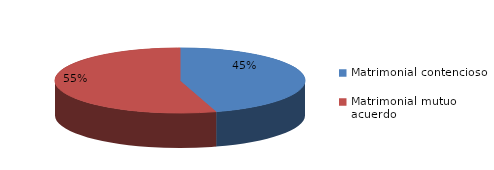
| Category | Series 0 |
|---|---|
| 0 | 209 |
| 1 | 252 |